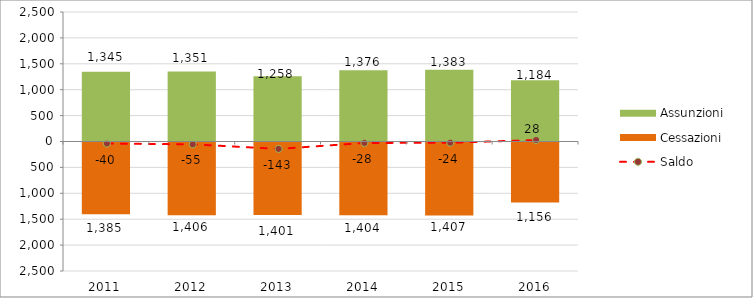
| Category | Assunzioni | Cessazioni |
|---|---|---|
| 2011.0 | 1345 | -1385 |
| 2012.0 | 1351 | -1406 |
| 2013.0 | 1258 | -1401 |
| 2014.0 | 1376 | -1404 |
| 2015.0 | 1383 | -1407 |
| 2016.0 | 1184 | -1156 |